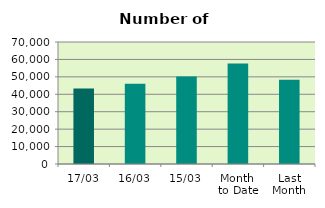
| Category | Series 0 |
|---|---|
| 17/03 | 43376 |
| 16/03 | 46064 |
| 15/03 | 50174 |
| Month 
to Date | 57596.615 |
| Last
Month | 48363.3 |